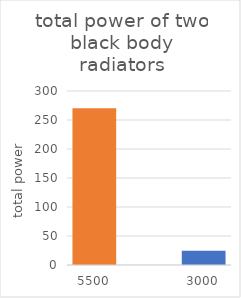
| Category | Series 0 |
|---|---|
| 5500.0 | 270.135 |
| nan | 0 |
| 3000.0 | 24.449 |